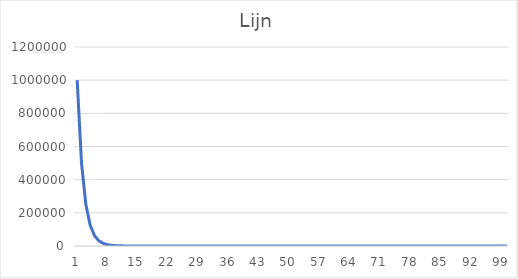
| Category | Series 0 |
|---|---|
| 0 | 1000000 |
| 1 | 500000 |
| 2 | 250000 |
| 3 | 125000 |
| 4 | 62500 |
| 5 | 31250 |
| 6 | 15625 |
| 7 | 7812.5 |
| 8 | 3906.25 |
| 9 | 1953.125 |
| 10 | 976.562 |
| 11 | 488.281 |
| 12 | 244.141 |
| 13 | 122.07 |
| 14 | 61.035 |
| 15 | 30.518 |
| 16 | 15.259 |
| 17 | 7.629 |
| 18 | 3.815 |
| 19 | 1.907 |
| 20 | 0.954 |
| 21 | 0.477 |
| 22 | 0.238 |
| 23 | 0.119 |
| 24 | 0.06 |
| 25 | 0.03 |
| 26 | 0.015 |
| 27 | 0.007 |
| 28 | 0.004 |
| 29 | 0.002 |
| 30 | 0.001 |
| 31 | 0 |
| 32 | 0 |
| 33 | 0 |
| 34 | 0 |
| 35 | 0 |
| 36 | 0 |
| 37 | 0 |
| 38 | 0 |
| 39 | 0 |
| 40 | 0 |
| 41 | 0 |
| 42 | 0 |
| 43 | 0 |
| 44 | 0 |
| 45 | 0 |
| 46 | 0 |
| 47 | 0 |
| 48 | 0 |
| 49 | 0 |
| 50 | 0 |
| 51 | 0 |
| 52 | 0 |
| 53 | 0 |
| 54 | 0 |
| 55 | 0 |
| 56 | 0 |
| 57 | 0 |
| 58 | 0 |
| 59 | 0 |
| 60 | 0 |
| 61 | 0 |
| 62 | 0 |
| 63 | 0 |
| 64 | 0 |
| 65 | 0 |
| 66 | 0 |
| 67 | 0 |
| 68 | 0 |
| 69 | 0 |
| 70 | 0 |
| 71 | 0 |
| 72 | 0 |
| 73 | 0 |
| 74 | 0 |
| 75 | 0 |
| 76 | 0 |
| 77 | 0 |
| 78 | 0 |
| 79 | 0 |
| 80 | 0 |
| 81 | 0 |
| 82 | 0 |
| 83 | 0 |
| 84 | 0 |
| 85 | 0 |
| 86 | 0 |
| 87 | 0 |
| 88 | 0 |
| 89 | 0 |
| 90 | 0 |
| 91 | 0 |
| 92 | 0 |
| 93 | 0 |
| 94 | 0 |
| 95 | 0 |
| 96 | 0 |
| 97 | 0 |
| 98 | 0 |
| 99 | 0 |